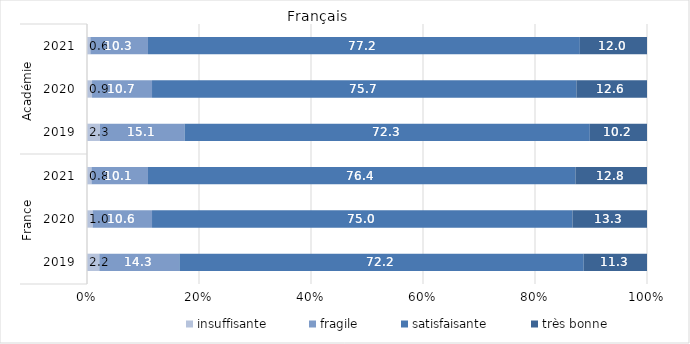
| Category | insuffisante | fragile | satisfaisante | très bonne |
|---|---|---|---|---|
| 0 | 2.2 | 14.3 | 72.2 | 11.3 |
| 1 | 1 | 10.6 | 75 | 13.3 |
| 2 | 0.8 | 10.1 | 76.4 | 12.8 |
| 3 | 2.3 | 15.1 | 72.3 | 10.2 |
| 4 | 0.9 | 10.7 | 75.7 | 12.6 |
| 5 | 0.6 | 10.3 | 77.2 | 12 |